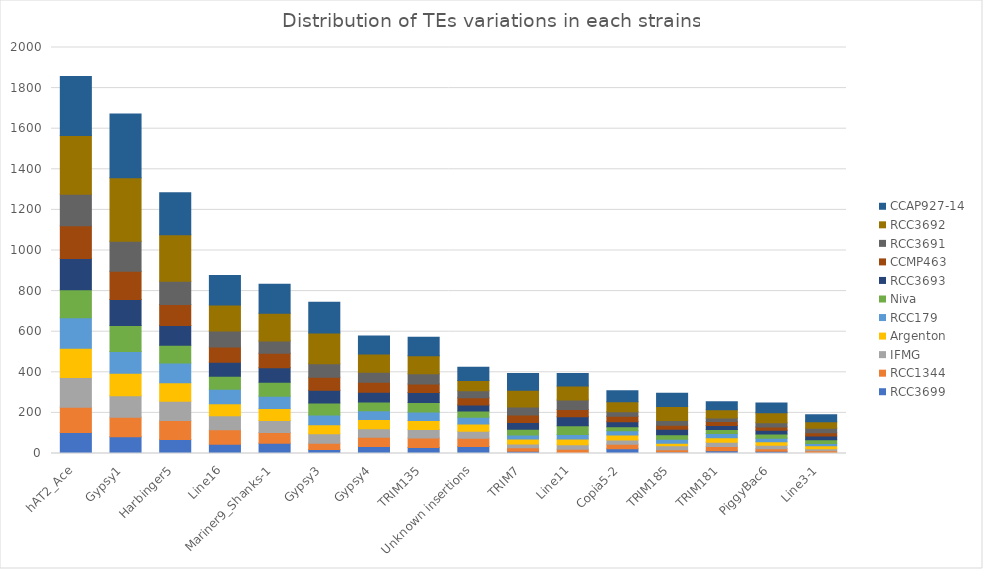
| Category | RCC3699 | RCC1344 | IFMG | Argenton | RCC179 | Niva | RCC3693 | CCMP463 | RCC3691 | RCC3692 | CCAP927-14 |
|---|---|---|---|---|---|---|---|---|---|---|---|
| hAT2_Ace | 104 | 124 | 146 | 145 | 150 | 138 | 154 | 161 | 155 | 290 | 290 |
| Gypsy1 | 83 | 96 | 106 | 110 | 107 | 128 | 129 | 139 | 147 | 313 | 315 |
| Harbinger5 | 69 | 93 | 95 | 91 | 98 | 87 | 98 | 103 | 115 | 228 | 207 |
| Line16 | 46 | 71 | 69 | 59 | 71 | 65 | 69 | 75 | 79 | 128 | 145 |
| Mariner9_Shanks-1 | 50 | 54 | 58 | 60 | 60 | 69 | 71 | 72 | 60 | 137 | 143 |
| Gypsy3 | 20 | 31 | 46 | 45 | 48 | 59 | 62 | 65 | 66 | 152 | 151 |
| Gypsy4 | 35 | 45 | 42 | 46 | 43 | 43 | 48 | 49 | 49 | 90 | 89 |
| TRIM135 | 29 | 47 | 42 | 45 | 42 | 46 | 49 | 42 | 51 | 89 | 91 |
| Unknown insertions | 34 | 41 | 34 | 36 | 34 | 30 | 30 | 36 | 34 | 51 | 65 |
| TRIM7 | 11 | 17 | 19 | 25 | 19 | 29 | 33 | 37 | 39 | 83 | 82 |
| Line11 | 5 | 16 | 22 | 28 | 22 | 44 | 44 | 36 | 47 | 69 | 61 |
| Copia5-2 | 24 | 22 | 21 | 24 | 21 | 20 | 25 | 27 | 22 | 49 | 54 |
| TRIM185 | 8 | 11 | 19 | 13 | 19 | 22 | 28 | 19 | 24 | 68 | 66 |
| TRIM181 | 13 | 21 | 22 | 21 | 22 | 19 | 20 | 20 | 17 | 40 | 40 |
| PiggyBac6 | 11 | 13 | 17 | 17 | 17 | 21 | 18 | 16 | 21 | 50 | 48 |
| Line3-1 | 4 | 9 | 11 | 14 | 11 | 19 | 18 | 16 | 23 | 31 | 35 |